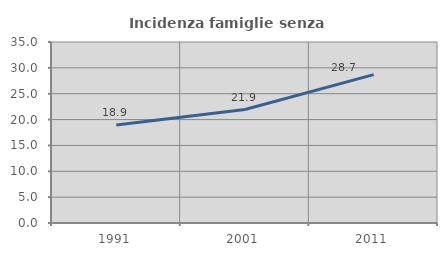
| Category | Incidenza famiglie senza nuclei |
|---|---|
| 1991.0 | 18.932 |
| 2001.0 | 21.937 |
| 2011.0 | 28.681 |